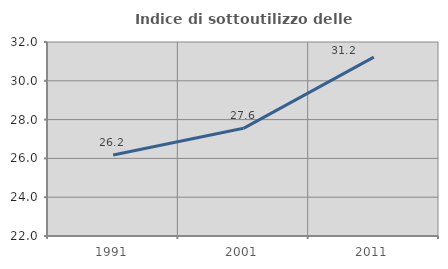
| Category | Indice di sottoutilizzo delle abitazioni  |
|---|---|
| 1991.0 | 26.178 |
| 2001.0 | 27.55 |
| 2011.0 | 31.221 |